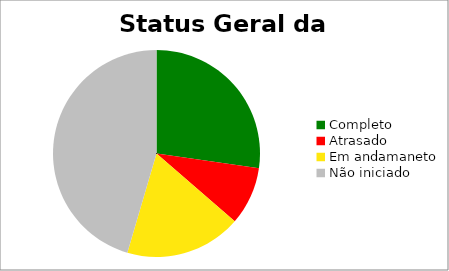
| Category | Series 0 |
|---|---|
| Completo | 0.273 |
| Atrasado | 0.091 |
| Em andamaneto | 0.182 |
| Não iniciado | 0.455 |